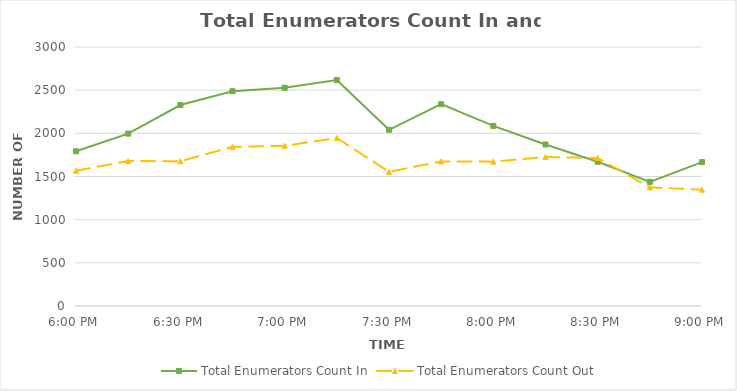
| Category | Total Enumerators Count In | Total Enumerators Count Out |
|---|---|---|
| 0.75 | 1792 | 1567 |
| 0.7604166666666666 | 1997 | 1679 |
| 0.7708333333333334 | 2328 | 1677 |
| 0.78125 | 2488 | 1843 |
| 0.7916666666666666 | 2528 | 1855 |
| 0.8020833333333334 | 2617 | 1946 |
| 0.8125 | 2041 | 1554 |
| 0.8229166666666666 | 2338 | 1675 |
| 0.8333333333333334 | 2086 | 1672 |
| 0.84375 | 1871 | 1726 |
| 0.8541666666666666 | 1671 | 1714 |
| 0.8645833333333334 | 1438 | 1374 |
| 0.875 | 1667 | 1347 |